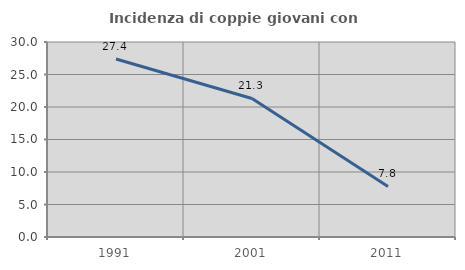
| Category | Incidenza di coppie giovani con figli |
|---|---|
| 1991.0 | 27.376 |
| 2001.0 | 21.311 |
| 2011.0 | 7.78 |